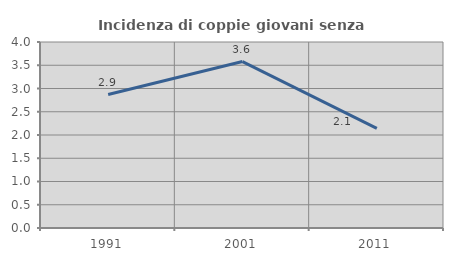
| Category | Incidenza di coppie giovani senza figli |
|---|---|
| 1991.0 | 2.871 |
| 2001.0 | 3.579 |
| 2011.0 | 2.144 |